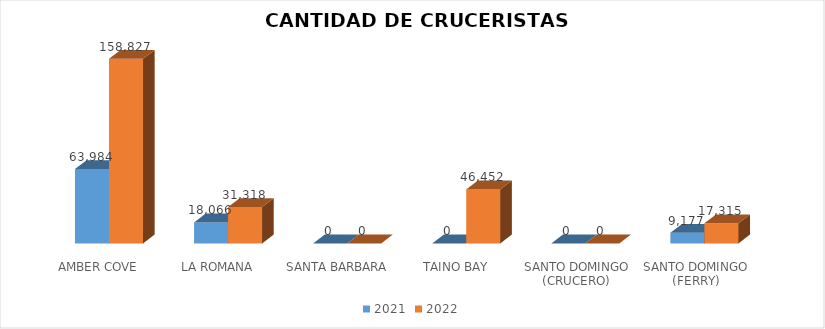
| Category | 2021 | 2022 |
|---|---|---|
| AMBER COVE | 63984 | 158827 |
| LA ROMANA | 18066 | 31318 |
| SANTA BARBARA | 0 | 0 |
| TAINO BAY | 0 | 46452 |
| SANTO DOMINGO (CRUCERO) | 0 | 0 |
| SANTO DOMINGO (FERRY) | 9177 | 17315 |